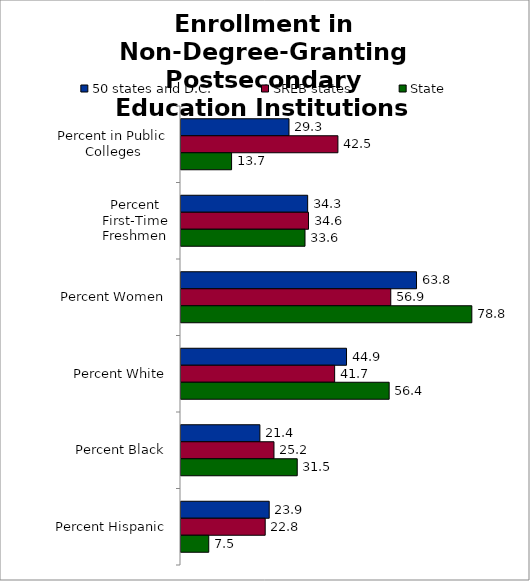
| Category | 50 states and D.C. | SREB states | State |
|---|---|---|---|
| 0 | 29.277 | 42.535 | 13.714 |
| 1 | 34.337 | 34.565 | 33.617 |
| 2 | 63.845 | 56.865 | 78.843 |
| 3 | 44.873 | 41.652 | 56.432 |
| 4 | 21.388 | 25.203 | 31.513 |
| 5 | 23.911 | 22.83 | 7.524 |